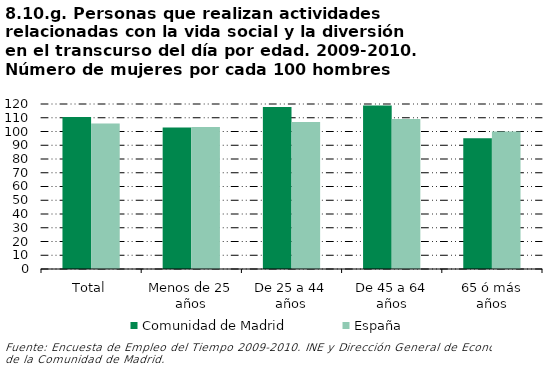
| Category | Comunidad de Madrid | España |
|---|---|---|
| Total | 110.617 | 105.893 |
| Menos de 25 años | 102.969 | 103.322 |
| De 25 a 44 años | 117.767 | 106.852 |
| De 45 a 64 años | 118.834 | 109.091 |
| 65 ó más años | 95.007 | 100 |